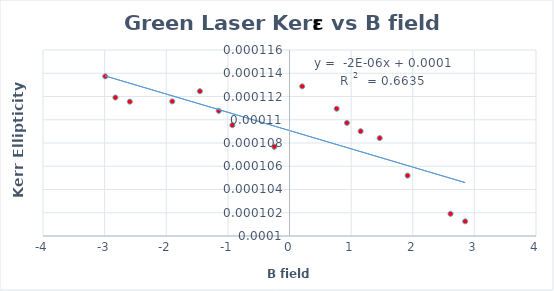
| Category | Kerr rotation vs B field |
|---|---|
| 0.20613650104754253 | 0 |
| 0.7653587854559196 | 0 |
| 0.9320593595728099 | 0 |
| 1.1543474248849594 | 0 |
| 1.463625617648605 | 0 |
| 1.9162003063157789 | 0 |
| 2.613158353421133 | 0 |
| 2.8510146946698858 | 0 |
| -0.24573646702910656 | 0 |
| -0.9273105589844111 | 0 |
| -1.1478991442165996 | 0 |
| -1.4544534647503606 | 0 |
| -1.902454902707921 | 0 |
| -2.5913694992876053 | 0 |
| -2.8252270511296085 | 0 |
| -2.9899345243513897 | 0 |